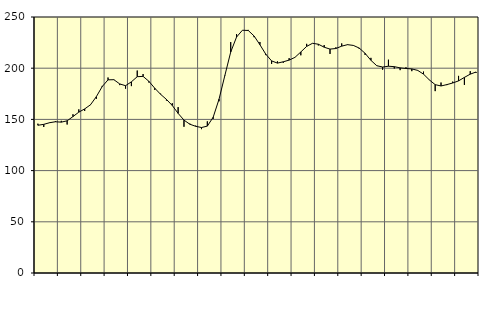
| Category | Piggar | Series 1 |
|---|---|---|
| nan | 145.8 | 144.28 |
| 1.0 | 142.6 | 145.16 |
| 1.0 | 147 | 146.76 |
| 1.0 | 148.4 | 147.7 |
| nan | 148.6 | 147.31 |
| 2.0 | 145 | 148.63 |
| 2.0 | 155 | 152.76 |
| 2.0 | 159.8 | 157.08 |
| nan | 158.2 | 160.23 |
| 3.0 | 164 | 164.3 |
| 3.0 | 170.1 | 172.21 |
| 3.0 | 182.7 | 182.03 |
| nan | 190.9 | 188.63 |
| 4.0 | 188.5 | 188.77 |
| 4.0 | 183.5 | 184.65 |
| 4.0 | 180 | 182.91 |
| nan | 182.5 | 186.7 |
| 5.0 | 197.7 | 191.7 |
| 5.0 | 194.3 | 192.01 |
| 5.0 | 186 | 187.19 |
| nan | 178.8 | 180.48 |
| 6.0 | 175.1 | 174.49 |
| 6.0 | 168.4 | 169.53 |
| 6.0 | 165.8 | 163.57 |
| nan | 162 | 155.88 |
| 7.0 | 142.8 | 149.31 |
| 7.0 | 145.9 | 145.3 |
| 7.0 | 143.9 | 143.25 |
| nan | 140.5 | 142.07 |
| 8.0 | 148.1 | 143.46 |
| 8.0 | 150.5 | 152.13 |
| 8.0 | 167.7 | 169.71 |
| nan | 193.3 | 192.89 |
| 9.0 | 225.5 | 215.78 |
| 9.0 | 233.3 | 230.41 |
| 9.0 | 237.1 | 237.07 |
| nan | 237.4 | 236.84 |
| 10.0 | 230.3 | 231.47 |
| 10.0 | 225.6 | 222.92 |
| 10.0 | 212.8 | 213.74 |
| nan | 204.2 | 207.13 |
| 11.0 | 206.7 | 204.96 |
| 11.0 | 205.3 | 206.28 |
| 11.0 | 209.8 | 207.9 |
| nan | 210.6 | 210.58 |
| 12.0 | 212.6 | 215.86 |
| 12.0 | 223.8 | 221.29 |
| 12.0 | 224.4 | 224.31 |
| nan | 222.2 | 223.43 |
| 13.0 | 222.6 | 220.5 |
| 13.0 | 213.9 | 218.65 |
| 13.0 | 220.4 | 219.21 |
| nan | 224.2 | 221.53 |
| 14.0 | 223.3 | 222.99 |
| 14.0 | 222 | 222.24 |
| 14.0 | 218.9 | 219.66 |
| nan | 213 | 214.53 |
| 15.0 | 210.1 | 207.69 |
| 15.0 | 202.6 | 202.43 |
| 15.0 | 198.5 | 201.15 |
| nan | 208.3 | 201.93 |
| 16.0 | 199.7 | 201.5 |
| 16.0 | 198.1 | 200.33 |
| 16.0 | 200.9 | 199.72 |
| nan | 197.1 | 199.29 |
| 17.0 | 197.6 | 197.89 |
| 17.0 | 196.7 | 194.2 |
| 17.0 | 188.4 | 188.57 |
| nan | 177.6 | 183.93 |
| 18.0 | 186 | 182.64 |
| 18.0 | 183.5 | 183.98 |
| 18.0 | 186.9 | 185.55 |
| nan | 192.5 | 187.62 |
| 19.0 | 183.7 | 191.01 |
| 19.0 | 197.1 | 194.17 |
| 19.0 | 195.4 | 196.29 |